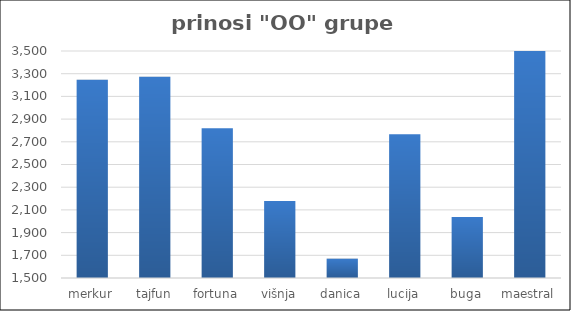
| Category | Series 0 |
|---|---|
| merkur | 3246.92 |
| tajfun | 3272.75 |
| fortuna | 2818.667 |
| višnja | 2178.6 |
| danica | 1670.31 |
| lucija | 2767.495 |
| buga | 2037.4 |
| maestral | 3499 |